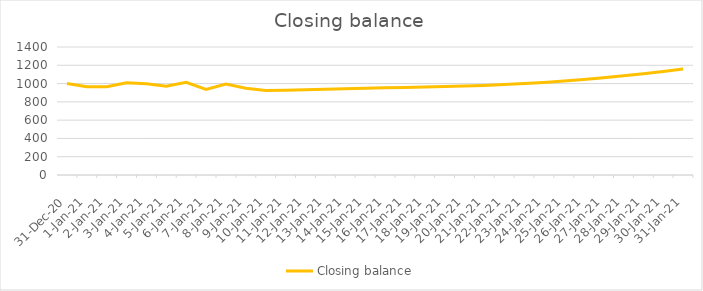
| Category | Closing balance |
|---|---|
| 2020-12-31 | 1000 |
| 2021-01-01 | 966 |
| 2021-01-02 | 966 |
| 2021-01-03 | 1009 |
| 2021-01-04 | 998 |
| 2021-01-05 | 970 |
| 2021-01-06 | 1014 |
| 2021-01-07 | 935 |
| 2021-01-08 | 995 |
| 2021-01-09 | 948 |
| 2021-01-10 | 923 |
| 2021-01-11 | 928 |
| 2021-01-12 | 933 |
| 2021-01-13 | 938 |
| 2021-01-14 | 943 |
| 2021-01-15 | 948 |
| 2021-01-16 | 953 |
| 2021-01-17 | 958 |
| 2021-01-18 | 963 |
| 2021-01-19 | 968 |
| 2021-01-20 | 973 |
| 2021-01-21 | 980 |
| 2021-01-22 | 989 |
| 2021-01-23 | 1000 |
| 2021-01-24 | 1013 |
| 2021-01-25 | 1028 |
| 2021-01-26 | 1045 |
| 2021-01-27 | 1064 |
| 2021-01-28 | 1085 |
| 2021-01-29 | 1108 |
| 2021-01-30 | 1133 |
| 2021-01-31 | 1160 |